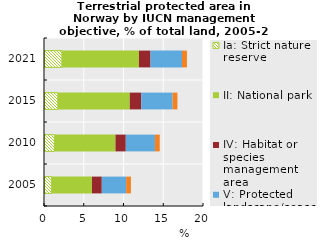
| Category | Ia: Strict nature reserve | II: National park | IV: Habitat or species management area | V: Protected landscape/seascape | No IUCN category |
|---|---|---|---|---|---|
| 2005.0 | 0.959 | 5.072 | 1.238 | 3.06 | 0.605 |
| 2010.0 | 1.306 | 7.687 | 1.293 | 3.665 | 0.608 |
| 2015.0 | 1.741 | 9.051 | 1.435 | 3.943 | 0.616 |
| 2021.0 | 2.251 | 9.692 | 1.451 | 3.967 | 0.619 |